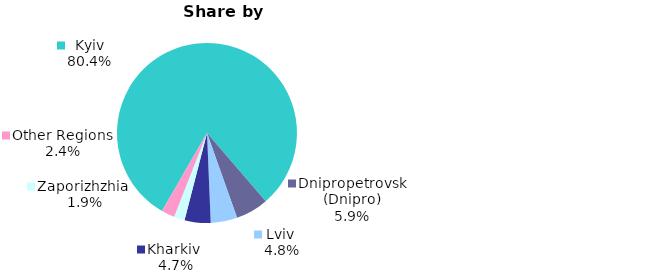
| Category | Series 0 |
|---|---|
| Kyiv | 0.804 |
| Dnipropetrovsk (Dnipro) | 0.059 |
| Lviv  | 0.048 |
| Kharkiv  | 0.047 |
| Zaporizhzhia  | 0.019 |
| Other Regions | 0.024 |